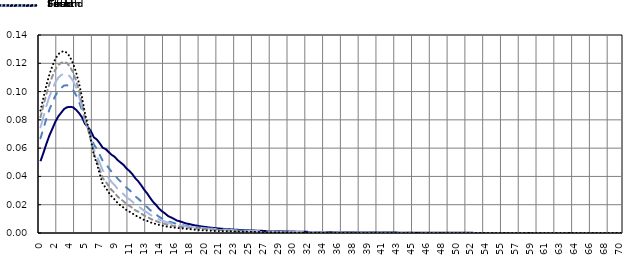
| Category | First | Second | Third | Fourth | Fifth |
|---|---|---|---|---|---|
| 0.07035176 | 0.051 | 0.067 | 0.075 | 0.082 | 0.087 |
| 0.42713568 | 0.057 | 0.074 | 0.082 | 0.09 | 0.096 |
| 0.7839196 | 0.063 | 0.081 | 0.09 | 0.098 | 0.105 |
| 1.1407035 | 0.069 | 0.087 | 0.096 | 0.105 | 0.112 |
| 1.4974874 | 0.074 | 0.092 | 0.102 | 0.111 | 0.118 |
| 1.8542714 | 0.079 | 0.097 | 0.106 | 0.116 | 0.123 |
| 2.2110553 | 0.082 | 0.101 | 0.11 | 0.119 | 0.126 |
| 2.5678392 | 0.085 | 0.103 | 0.112 | 0.12 | 0.128 |
| 2.9246231 | 0.088 | 0.104 | 0.113 | 0.121 | 0.129 |
| 3.281407 | 0.089 | 0.104 | 0.112 | 0.12 | 0.127 |
| 3.638191 | 0.089 | 0.103 | 0.111 | 0.117 | 0.124 |
| 3.9949749 | 0.089 | 0.101 | 0.108 | 0.114 | 0.12 |
| 4.3517588 | 0.087 | 0.097 | 0.103 | 0.108 | 0.114 |
| 4.7085427 | 0.085 | 0.093 | 0.097 | 0.101 | 0.106 |
| 5.0653266 | 0.082 | 0.087 | 0.089 | 0.092 | 0.096 |
| 5.4221106 | 0.077 | 0.079 | 0.08 | 0.081 | 0.085 |
| 5.7788945 | 0.075 | 0.074 | 0.074 | 0.074 | 0.076 |
| 6.1356784 | 0.072 | 0.069 | 0.067 | 0.066 | 0.066 |
| 6.4924623 | 0.068 | 0.063 | 0.059 | 0.056 | 0.055 |
| 6.8492462 | 0.066 | 0.059 | 0.055 | 0.051 | 0.049 |
| 7.2060302 | 0.063 | 0.055 | 0.049 | 0.045 | 0.042 |
| 7.5628141 | 0.06 | 0.051 | 0.044 | 0.039 | 0.035 |
| 7.919598 | 0.059 | 0.049 | 0.042 | 0.036 | 0.032 |
| 8.2763819 | 0.057 | 0.046 | 0.039 | 0.033 | 0.029 |
| 8.6331658 | 0.055 | 0.043 | 0.036 | 0.03 | 0.026 |
| 8.9899497 | 0.054 | 0.041 | 0.034 | 0.028 | 0.024 |
| 9.3467337 | 0.052 | 0.039 | 0.031 | 0.026 | 0.021 |
| 9.7035176 | 0.05 | 0.036 | 0.029 | 0.024 | 0.019 |
| 10.060302 | 0.048 | 0.035 | 0.028 | 0.022 | 0.018 |
| 10.417085 | 0.046 | 0.032 | 0.025 | 0.02 | 0.016 |
| 10.773869 | 0.044 | 0.03 | 0.024 | 0.019 | 0.015 |
| 11.130653 | 0.042 | 0.028 | 0.022 | 0.018 | 0.014 |
| 11.487437 | 0.039 | 0.026 | 0.02 | 0.016 | 0.012 |
| 11.844221 | 0.036 | 0.024 | 0.019 | 0.015 | 0.011 |
| 12.201005 | 0.034 | 0.022 | 0.017 | 0.014 | 0.01 |
| 12.557789 | 0.031 | 0.02 | 0.016 | 0.012 | 0.009 |
| 12.914573 | 0.028 | 0.018 | 0.014 | 0.011 | 0.008 |
| 13.271357 | 0.025 | 0.016 | 0.013 | 0.01 | 0.008 |
| 13.628141 | 0.022 | 0.014 | 0.012 | 0.009 | 0.007 |
| 13.984925 | 0.02 | 0.013 | 0.011 | 0.008 | 0.006 |
| 14.341709 | 0.017 | 0.011 | 0.01 | 0.008 | 0.006 |
| 14.698492 | 0.015 | 0.01 | 0.009 | 0.007 | 0.005 |
| 15.055276 | 0.014 | 0.009 | 0.008 | 0.006 | 0.005 |
| 15.41206 | 0.012 | 0.008 | 0.007 | 0.006 | 0.004 |
| 15.768844 | 0.011 | 0.008 | 0.007 | 0.005 | 0.004 |
| 16.125628 | 0.01 | 0.007 | 0.006 | 0.005 | 0.004 |
| 16.482412 | 0.009 | 0.006 | 0.006 | 0.005 | 0.004 |
| 16.839196 | 0.008 | 0.006 | 0.005 | 0.004 | 0.003 |
| 17.19598 | 0.008 | 0.006 | 0.005 | 0.004 | 0.003 |
| 17.552764 | 0.007 | 0.005 | 0.005 | 0.004 | 0.003 |
| 17.909548 | 0.006 | 0.005 | 0.004 | 0.004 | 0.003 |
| 18.266332 | 0.006 | 0.005 | 0.004 | 0.003 | 0.003 |
| 18.623116 | 0.005 | 0.004 | 0.004 | 0.003 | 0.002 |
| 18.979899 | 0.005 | 0.004 | 0.004 | 0.003 | 0.002 |
| 19.336683 | 0.005 | 0.004 | 0.004 | 0.003 | 0.002 |
| 19.693467 | 0.004 | 0.004 | 0.003 | 0.003 | 0.002 |
| 20.050251 | 0.004 | 0.003 | 0.003 | 0.003 | 0.002 |
| 20.407035 | 0.004 | 0.003 | 0.003 | 0.003 | 0.002 |
| 20.763819 | 0.004 | 0.003 | 0.003 | 0.002 | 0.002 |
| 21.120603 | 0.003 | 0.003 | 0.003 | 0.002 | 0.001 |
| 21.477387 | 0.003 | 0.003 | 0.003 | 0.002 | 0.001 |
| 21.834171 | 0.003 | 0.003 | 0.003 | 0.002 | 0.001 |
| 22.190955 | 0.003 | 0.002 | 0.002 | 0.002 | 0.001 |
| 22.547739 | 0.003 | 0.002 | 0.002 | 0.002 | 0.001 |
| 22.904523 | 0.003 | 0.002 | 0.002 | 0.002 | 0.001 |
| 23.261307 | 0.002 | 0.002 | 0.002 | 0.002 | 0.001 |
| 23.61809 | 0.002 | 0.002 | 0.002 | 0.001 | 0.001 |
| 23.974874 | 0.002 | 0.002 | 0.002 | 0.001 | 0.001 |
| 24.331658 | 0.002 | 0.002 | 0.002 | 0.001 | 0.001 |
| 24.688442 | 0.002 | 0.002 | 0.002 | 0.001 | 0.001 |
| 25.045226 | 0.002 | 0.002 | 0.002 | 0.001 | 0.001 |
| 25.40201 | 0.002 | 0.001 | 0.001 | 0.001 | 0.001 |
| 25.758794 | 0.002 | 0.001 | 0.001 | 0.001 | 0.001 |
| 26.115578 | 0.002 | 0.001 | 0.001 | 0.001 | 0.001 |
| 26.472362 | 0.002 | 0.001 | 0.001 | 0.001 | 0.001 |
| 26.829146 | 0.002 | 0.001 | 0.001 | 0.001 | 0.001 |
| 27.18593 | 0.001 | 0.001 | 0.001 | 0.001 | 0.001 |
| 27.542714 | 0.001 | 0.001 | 0.001 | 0.001 | 0.001 |
| 27.899497 | 0.001 | 0.001 | 0.001 | 0.001 | 0.001 |
| 28.256281 | 0.001 | 0.001 | 0.001 | 0.001 | 0 |
| 28.613065 | 0.001 | 0.001 | 0.001 | 0.001 | 0 |
| 28.969849 | 0.001 | 0.001 | 0.001 | 0.001 | 0 |
| 29.326633 | 0.001 | 0.001 | 0.001 | 0 | 0 |
| 29.683417 | 0.001 | 0.001 | 0.001 | 0 | 0 |
| 30.040201 | 0.001 | 0.001 | 0.001 | 0 | 0 |
| 30.396985 | 0.001 | 0.001 | 0.001 | 0 | 0 |
| 30.753769 | 0.001 | 0.001 | 0.001 | 0 | 0 |
| 31.110553 | 0.001 | 0.001 | 0.001 | 0 | 0 |
| 31.467337 | 0.001 | 0.001 | 0.001 | 0 | 0 |
| 31.824121 | 0.001 | 0.001 | 0.001 | 0 | 0 |
| 32.180905 | 0.001 | 0.001 | 0.001 | 0 | 0 |
| 32.537688 | 0.001 | 0.001 | 0.001 | 0 | 0 |
| 32.894472 | 0.001 | 0.001 | 0.001 | 0 | 0 |
| 33.251256 | 0.001 | 0.001 | 0.001 | 0 | 0 |
| 33.60804 | 0.001 | 0.001 | 0.001 | 0 | 0 |
| 33.964824 | 0.001 | 0.001 | 0.001 | 0 | 0 |
| 34.321608 | 0.001 | 0.001 | 0 | 0 | 0 |
| 34.678392 | 0.001 | 0.001 | 0 | 0 | 0 |
| 35.035176 | 0.001 | 0 | 0 | 0 | 0 |
| 35.39196 | 0.001 | 0 | 0 | 0 | 0 |
| 35.748744 | 0.001 | 0 | 0 | 0 | 0 |
| 36.105528 | 0 | 0 | 0 | 0 | 0 |
| 36.462312 | 0 | 0 | 0 | 0 | 0 |
| 36.819095 | 0 | 0 | 0 | 0 | 0 |
| 37.175879 | 0 | 0 | 0 | 0 | 0 |
| 37.532663 | 0 | 0 | 0 | 0 | 0 |
| 37.889447 | 0 | 0 | 0 | 0 | 0 |
| 38.246231 | 0 | 0 | 0 | 0 | 0 |
| 38.603015 | 0 | 0 | 0 | 0 | 0 |
| 38.959799 | 0 | 0 | 0 | 0 | 0 |
| 39.316583 | 0 | 0 | 0 | 0 | 0 |
| 39.673367 | 0 | 0 | 0 | 0 | 0 |
| 40.030151 | 0 | 0 | 0 | 0 | 0 |
| 40.386935 | 0 | 0 | 0 | 0 | 0 |
| 40.743719 | 0 | 0 | 0 | 0 | 0 |
| 41.100503 | 0 | 0 | 0 | 0 | 0 |
| 41.457286 | 0 | 0 | 0 | 0 | 0 |
| 41.81407 | 0 | 0 | 0 | 0 | 0 |
| 42.170854 | 0 | 0 | 0 | 0 | 0 |
| 42.527638 | 0 | 0 | 0 | 0 | 0 |
| 42.884422 | 0 | 0 | 0 | 0 | 0 |
| 43.241206 | 0 | 0 | 0 | 0 | 0 |
| 43.59799 | 0 | 0 | 0 | 0 | 0 |
| 43.954774 | 0 | 0 | 0 | 0 | 0 |
| 44.311558 | 0 | 0 | 0 | 0 | 0 |
| 44.668342 | 0 | 0 | 0 | 0 | 0 |
| 45.025126 | 0 | 0 | 0 | 0 | 0 |
| 45.38191 | 0 | 0 | 0 | 0 | 0 |
| 45.738693 | 0 | 0 | 0 | 0 | 0 |
| 46.095477 | 0 | 0 | 0 | 0 | 0 |
| 46.452261 | 0 | 0 | 0 | 0 | 0 |
| 46.809045 | 0 | 0 | 0 | 0 | 0 |
| 47.165829 | 0 | 0 | 0 | 0 | 0 |
| 47.522613 | 0 | 0 | 0 | 0 | 0 |
| 47.879397 | 0 | 0 | 0 | 0 | 0 |
| 48.236181 | 0 | 0 | 0 | 0 | 0 |
| 48.592965 | 0 | 0 | 0 | 0 | 0 |
| 48.949749 | 0 | 0 | 0 | 0 | 0 |
| 49.306533 | 0 | 0 | 0 | 0 | 0 |
| 49.663317 | 0 | 0 | 0 | 0 | 0 |
| 50.020101 | 0 | 0 | 0 | 0 | 0 |
| 50.376884 | 0 | 0 | 0 | 0 | 0 |
| 50.733668 | 0 | 0 | 0 | 0 | 0 |
| 51.090452 | 0 | 0 | 0 | 0 | 0 |
| 51.447236 | 0 | 0 | 0 | 0 | 0 |
| 51.80402 | 0 | 0 | 0 | 0 | 0 |
| 52.160804 | 0 | 0 | 0 | 0 | 0 |
| 52.517588 | 0 | 0 | 0 | 0 | 0 |
| 52.874372 | 0 | 0 | 0 | 0 | 0 |
| 53.231156 | 0 | 0 | 0 | 0 | 0 |
| 53.58794 | 0 | 0 | 0 | 0 | 0 |
| 53.944724 | 0 | 0 | 0 | 0 | 0 |
| 54.301508 | 0 | 0 | 0 | 0 | 0 |
| 54.658291 | 0 | 0 | 0 | 0 | 0 |
| 55.015075 | 0 | 0 | 0 | 0 | 0 |
| 55.371859 | 0 | 0 | 0 | 0 | 0 |
| 55.728643 | 0 | 0 | 0 | 0 | 0 |
| 56.085427 | 0 | 0 | 0 | 0 | 0 |
| 56.442211 | 0 | 0 | 0 | 0 | 0 |
| 56.798995 | 0 | 0 | 0 | 0 | 0 |
| 57.155779 | 0 | 0 | 0 | 0 | 0 |
| 57.512563 | 0 | 0 | 0 | 0 | 0 |
| 57.869347 | 0 | 0 | 0 | 0 | 0 |
| 58.226131 | 0 | 0 | 0 | 0 | 0 |
| 58.582915 | 0 | 0 | 0 | 0 | 0 |
| 58.939698 | 0 | 0 | 0 | 0 | 0 |
| 59.296482 | 0 | 0 | 0 | 0 | 0 |
| 59.653266 | 0 | 0 | 0 | 0 | 0 |
| 60.01005 | 0 | 0 | 0 | 0 | 0 |
| 60.366834 | 0 | 0 | 0 | 0 | 0 |
| 60.723618 | 0 | 0 | 0 | 0 | 0 |
| 61.080402 | 0 | 0 | 0 | 0 | 0 |
| 61.437186 | 0 | 0 | 0 | 0 | 0 |
| 61.79397 | 0 | 0 | 0 | 0 | 0 |
| 62.150754 | 0 | 0 | 0 | 0 | 0 |
| 62.507538 | 0 | 0 | 0 | 0 | 0 |
| 62.864322 | 0 | 0 | 0 | 0 | 0 |
| 63.221106 | 0 | 0 | 0 | 0 | 0 |
| 63.577889 | 0 | 0 | 0 | 0 | 0 |
| 63.934673 | 0 | 0 | 0 | 0 | 0 |
| 64.291457 | 0 | 0 | 0 | 0 | 0 |
| 64.648241 | 0 | 0 | 0 | 0 | 0 |
| 65.005025 | 0 | 0 | 0 | 0 | 0 |
| 65.361809 | 0 | 0 | 0 | 0 | 0 |
| 65.718593 | 0 | 0 | 0 | 0 | 0 |
| 66.075377 | 0 | 0 | 0 | 0 | 0 |
| 66.432161 | 0 | 0 | 0 | 0 | 0 |
| 66.788945 | 0 | 0 | 0 | 0 | 0 |
| 67.145729 | 0 | 0 | 0 | 0 | 0 |
| 67.502513 | 0 | 0 | 0 | 0 | 0 |
| 67.859296 | 0 | 0 | 0 | 0 | 0 |
| 68.21608 | 0 | 0 | 0 | 0 | 0 |
| 68.572864 | 0 | 0 | 0 | 0 | 0 |
| 68.929648 | 0 | 0 | 0 | 0 | 0 |
| 69.286432 | 0 | 0 | 0 | 0 | 0 |
| 69.643216 | 0 | 0 | 0 | 0 | 0 |
| 70.0 | 0 | 0 | 0 | 0 | 0 |